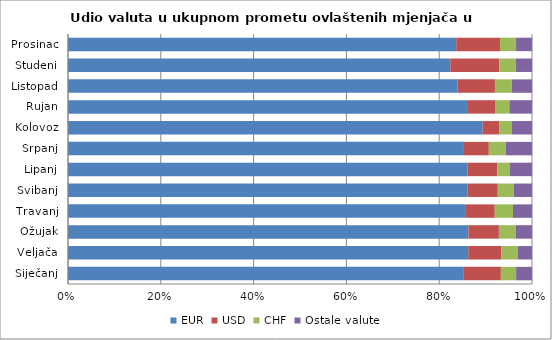
| Category | EUR | USD | CHF | Ostale valute |
|---|---|---|---|---|
| Siječanj | 0.852 | 0.081 | 0.033 | 0.034 |
| Veljača | 0.863 | 0.072 | 0.035 | 0.031 |
| Ožujak | 0.863 | 0.066 | 0.036 | 0.035 |
| Travanj | 0.856 | 0.064 | 0.039 | 0.041 |
| Svibanj | 0.861 | 0.065 | 0.034 | 0.039 |
| Lipanj | 0.861 | 0.064 | 0.026 | 0.048 |
| Srpanj | 0.853 | 0.054 | 0.037 | 0.056 |
| Kolovoz | 0.894 | 0.036 | 0.027 | 0.043 |
| Rujan | 0.86 | 0.06 | 0.031 | 0.049 |
| Listopad | 0.84 | 0.08 | 0.036 | 0.044 |
| Studeni | 0.824 | 0.105 | 0.035 | 0.035 |
| Prosinac | 0.837 | 0.094 | 0.035 | 0.034 |